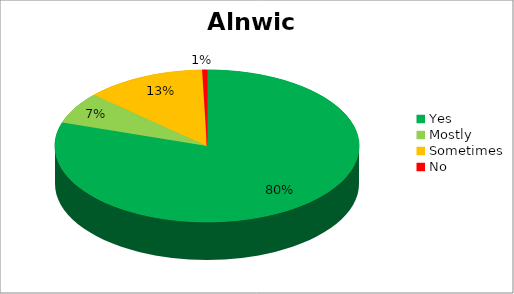
| Category | Alnwick |
|---|---|
| Yes | 156 |
| Mostly  | 13 |
| Sometimes | 25 |
| No | 1 |